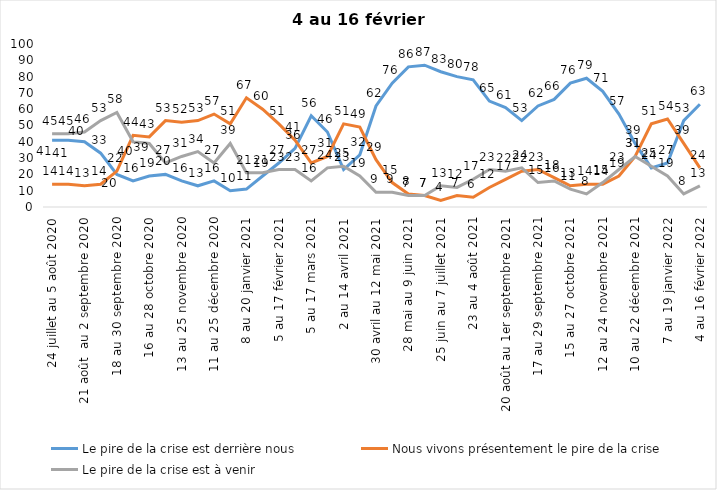
| Category | Le pire de la crise est derrière nous | Nous vivons présentement le pire de la crise | Le pire de la crise est à venir |
|---|---|---|---|
| 24 juillet au 5 août 2020 | 41 | 14 | 45 |
| 7 au 19 août 2020 | 41 | 14 | 45 |
| 21 août  au 2 septembre 2020 | 40 | 13 | 46 |
| 4 au 16 septembre 2020 | 33 | 14 | 53 |
| 18 au 30 septembre 2020 | 20 | 22 | 58 |
| 2 au 14 octobre 2020 | 16 | 44 | 40 |
| 16 au 28 octobre 2020 | 19 | 43 | 39 |
| 30 octobre au 11 novembre 2020 | 20 | 53 | 27 |
| 13 au 25 novembre 2020 | 16 | 52 | 31 |
| 27 au 9 décembre 2020 | 13 | 53 | 34 |
| 11 au 25 décembre 2020 | 16 | 57 | 27 |
| 25 décembre 2020 au 6 janvier 2021 | 10 | 51 | 39 |
| 8 au 20 janvier 2021 | 11 | 67 | 21 |
| 22 janvier au 3 février 2021 | 19 | 60 | 21 |
| 5 au 17 février 2021 | 27 | 51 | 23 |
| 19 février au 3 mars 2021 | 36 | 41 | 23 |
| 5 au 17 mars 2021 | 56 | 27 | 16 |
| 19 au 31 mars 2021 | 46 | 31 | 24 |
| 2 au 14 avril 2021 | 23 | 51 | 25 |
| 16 au 28 avril 2021 | 32 | 49 | 19 |
| 30 avril au 12 mai 2021 | 62 | 29 | 9 |
| 14 au 26 mai 2021 | 76 | 15 | 9 |
| 28 mai au 9 juin 2021 | 86 | 8 | 7 |
| 11 au 23 juin 2021 | 87 | 7 | 7 |
| 25 juin au 7 juillet 2021 | 83 | 4 | 13 |
| 9 au 21 juillet 2021 2021 | 80 | 7 | 12 |
| 23 au 4 août 2021 | 78 | 6 | 17 |
| 6 au 18 août 2021 | 65 | 12 | 23 |
| 20 août au 1er septembre 2021 | 61 | 17 | 22 |
| 3 au 15 septembre 2021 | 53 | 22 | 24 |
| 17 au 29 septembre 2021 | 62 | 23 | 15 |
| 1 au 13 octobre 2021 | 66 | 18 | 16 |
| 15 au 27 octobre 2021 | 76 | 13 | 11 |
| 29 octobre au 10 novembre 2021 | 79 | 14 | 8 |
| 12 au 24 novembre 2021 | 71 | 14 | 15 |
| 26 novembre au 8 décembre 2021 | 57 | 19 | 23 |
| 10 au 22 décembre 2021 | 39 | 31 | 31 |
| 24 décembre 2021 au 5 janvier 2022 2022 | 24 | 51 | 25 |
| 7 au 19 janvier 2022 | 27 | 54 | 19 |
| 21 janvier au 2 février 2022 | 53 | 39 | 8 |
| 4 au 16 février 2022 | 63 | 24 | 13 |